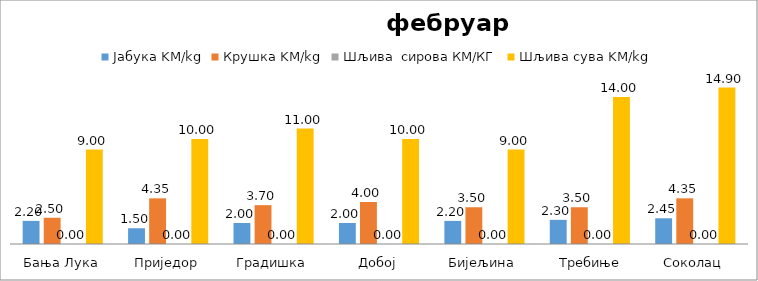
| Category | Јабука | Крушка | Шљива  сирова | Шљива сува |
|---|---|---|---|---|
| Бања Лука | 2.2 | 2.5 | 0 | 9 |
| Приједор | 1.5 | 4.35 | 0 | 10 |
| Градишка | 2 | 3.7 | 0 | 11 |
| Добој | 2 | 4 | 0 | 10 |
| Бијељина | 2.2 | 3.5 | 0 | 9 |
|  Требиње | 2.3 | 3.5 | 0 | 14 |
| Соколац | 2.45 | 4.35 | 0 | 14.9 |